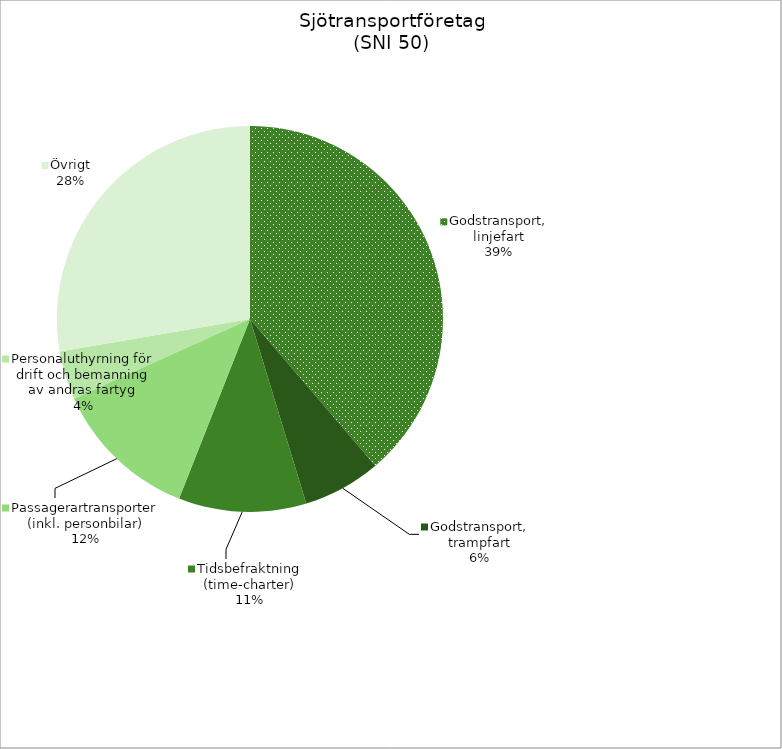
| Category | Series 0 |
|---|---|
| Godstransport, linjefart | 13273.542 |
| Godstransport, trampfart | 2239.811 |
| Tidsbefraktning (time-charter) | 3663.797 |
| Passagerartransporter (inkl. personbilar) | 4200.838 |
| Personaluthyrning för drift och bemanning av andras fartyg | 1386.777 |
| Övrigt | 9487.239 |